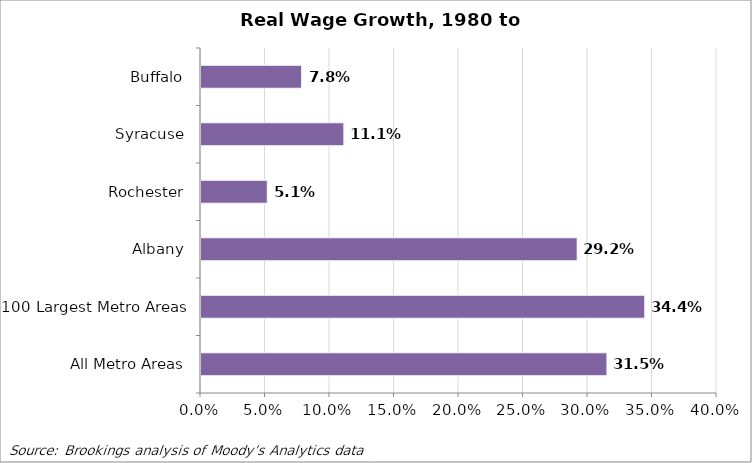
| Category | Real wage growth, 1980 to 2009 |
|---|---|
| All Metro Areas | 0.315 |
| 100 Largest Metro Areas | 0.344 |
| Albany | 0.292 |
| Rochester | 0.051 |
| Syracuse | 0.111 |
| Buffalo | 0.078 |